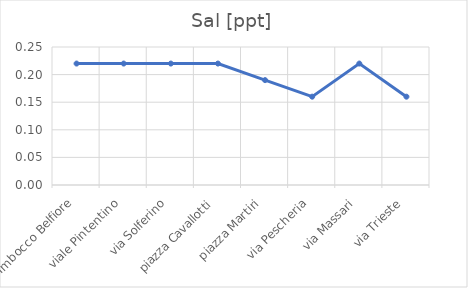
| Category | Sal [ppt] |
|---|---|
| Imbocco Belfiore | 0.22 |
| viale Pintentino | 0.22 |
| via Solferino | 0.22 |
| piazza Cavallotti | 0.22 |
| piazza Martiri | 0.19 |
| via Pescheria | 0.16 |
| via Massari | 0.22 |
| via Trieste | 0.16 |